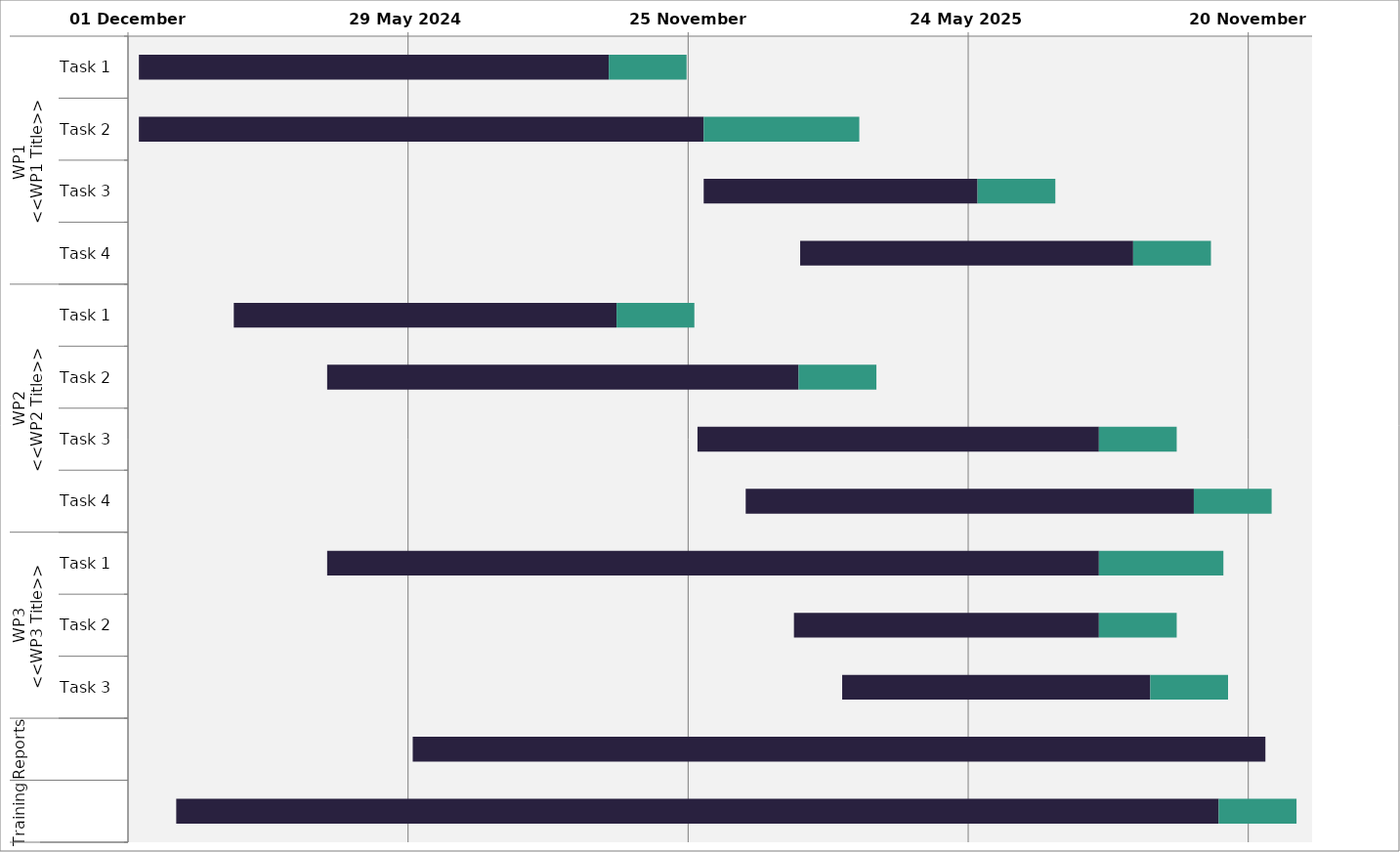
| Category | Start Date | Days | Contingency |
|---|---|---|---|
| 0 | 08/12/2023 | 302 | 50 |
| 1 | 08/12/2023 | 363 | 100 |
| 2 | 05/12/2024 | 176 | 50 |
| 3 | 05/02/2025 | 214 | 50 |
| 4 | 07/02/2024 | 246 | 50 |
| 5 | 07/04/2024 | 303 | 50 |
| 6 | 01/12/2024 | 258 | 50 |
| 7 | 01/01/2025 | 288 | 50 |
| 8 | 07/04/2024 | 496 | 80 |
| 9 | 01/02/2025 | 196 | 50 |
| 10 | 04/03/2025 | 198 | 50 |
| 11 | 01/06/2024 | 548 | 0 |
| 12 | 01/01/2024 | 670 | 50 |